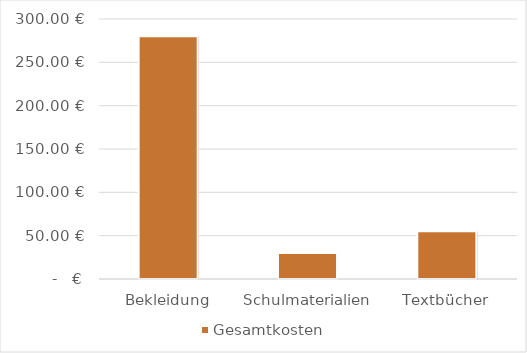
| Category | Gesamtkosten |
|---|---|
| Bekleidung | 280 |
| Schulmaterialien | 30 |
| Textbücher | 55 |